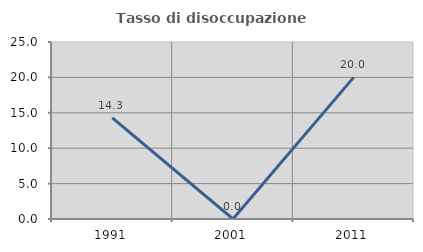
| Category | Tasso di disoccupazione giovanile  |
|---|---|
| 1991.0 | 14.286 |
| 2001.0 | 0 |
| 2011.0 | 20 |